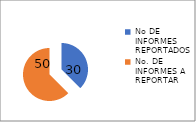
| Category | Series 0 |
|---|---|
| No DE INFORMES REPORTADOS | 30 |
| No. DE INFORMES A REPORTAR | 50 |